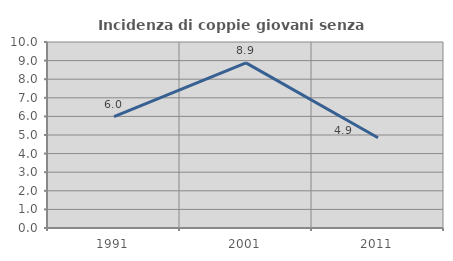
| Category | Incidenza di coppie giovani senza figli |
|---|---|
| 1991.0 | 5.985 |
| 2001.0 | 8.88 |
| 2011.0 | 4.854 |